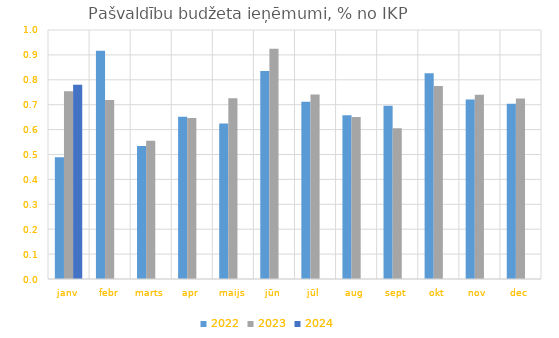
| Category | 2022 | 2023 | 2024 |
|---|---|---|---|
| janv | 0.489 | 0.754 | 0.78 |
| febr | 0.916 | 0.719 | 0 |
| marts | 0.534 | 0.555 | 0 |
| apr | 0.652 | 0.646 | 0 |
| maijs | 0.625 | 0.726 | 0 |
| jūn | 0.835 | 0.925 | 0 |
| jūl | 0.712 | 0.741 | 0 |
| aug | 0.658 | 0.65 | 0 |
| sept | 0.696 | 0.606 | 0 |
| okt | 0.826 | 0.776 | 0 |
| nov | 0.721 | 0.74 | 0 |
| dec | 0.704 | 0.725 | 0 |